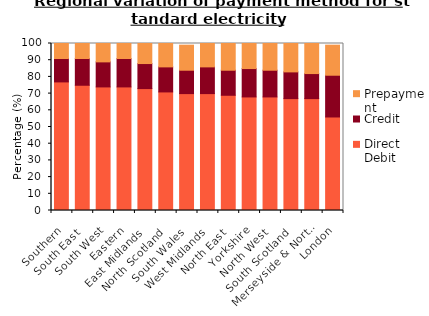
| Category | Direct Debit | Credit | Prepayment |
|---|---|---|---|
| Southern | 77 | 14 | 9 |
| South East | 75 | 16 | 10 |
| South West | 74 | 15 | 11 |
| Eastern | 74 | 17 | 10 |
| East Midlands | 73 | 15 | 12 |
| North Scotland | 71 | 15 | 14 |
| South Wales | 70 | 14 | 15 |
| West Midlands | 70 | 16 | 14 |
| North East | 69 | 15 | 16 |
| Yorkshire | 68 | 17 | 15 |
| North West | 68 | 16 | 16 |
| South Scotland | 67 | 16 | 17 |
| Merseyside & North Wales | 67 | 15 | 19 |
| London | 56 | 25 | 18 |